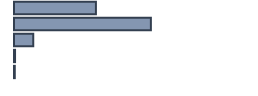
| Category | Percentatge |
|---|---|
| 0 | 34.133 |
| 1 | 57.034 |
| 2 | 8.07 |
| 3 | 0.436 |
| 4 | 0.327 |